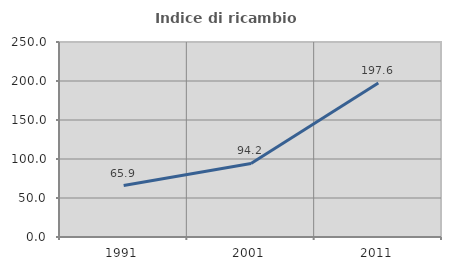
| Category | Indice di ricambio occupazionale  |
|---|---|
| 1991.0 | 65.92 |
| 2001.0 | 94.236 |
| 2011.0 | 197.561 |